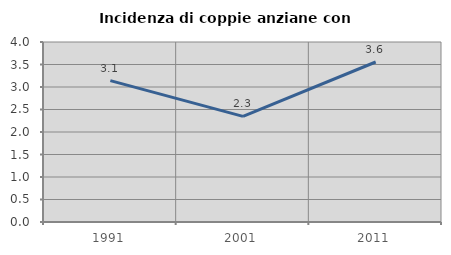
| Category | Incidenza di coppie anziane con figli |
|---|---|
| 1991.0 | 3.141 |
| 2001.0 | 2.347 |
| 2011.0 | 3.556 |